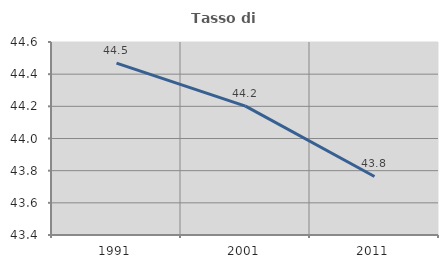
| Category | Tasso di occupazione   |
|---|---|
| 1991.0 | 44.469 |
| 2001.0 | 44.201 |
| 2011.0 | 43.764 |